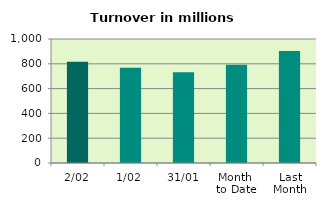
| Category | Series 0 |
|---|---|
| 2/02 | 817.493 |
| 1/02 | 768.019 |
| 31/01 | 731.889 |
| Month 
to Date | 792.756 |
| Last
Month | 902.557 |